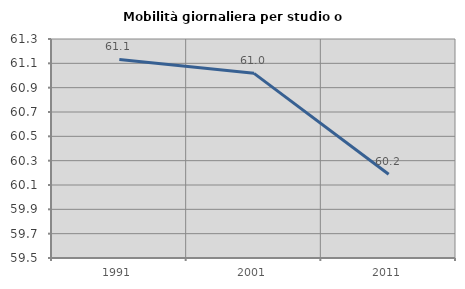
| Category | Mobilità giornaliera per studio o lavoro |
|---|---|
| 1991.0 | 61.132 |
| 2001.0 | 61.018 |
| 2011.0 | 60.188 |